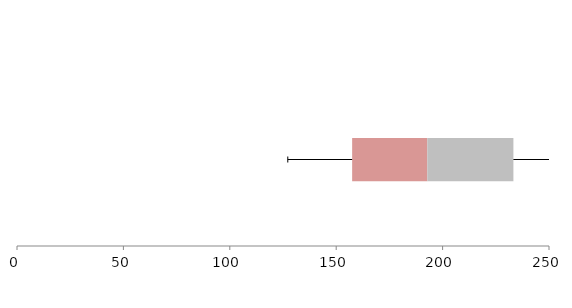
| Category | Series 1 | Series 2 | Series 3 |
|---|---|---|---|
| 0 | 157.492 | 35.329 | 40.452 |